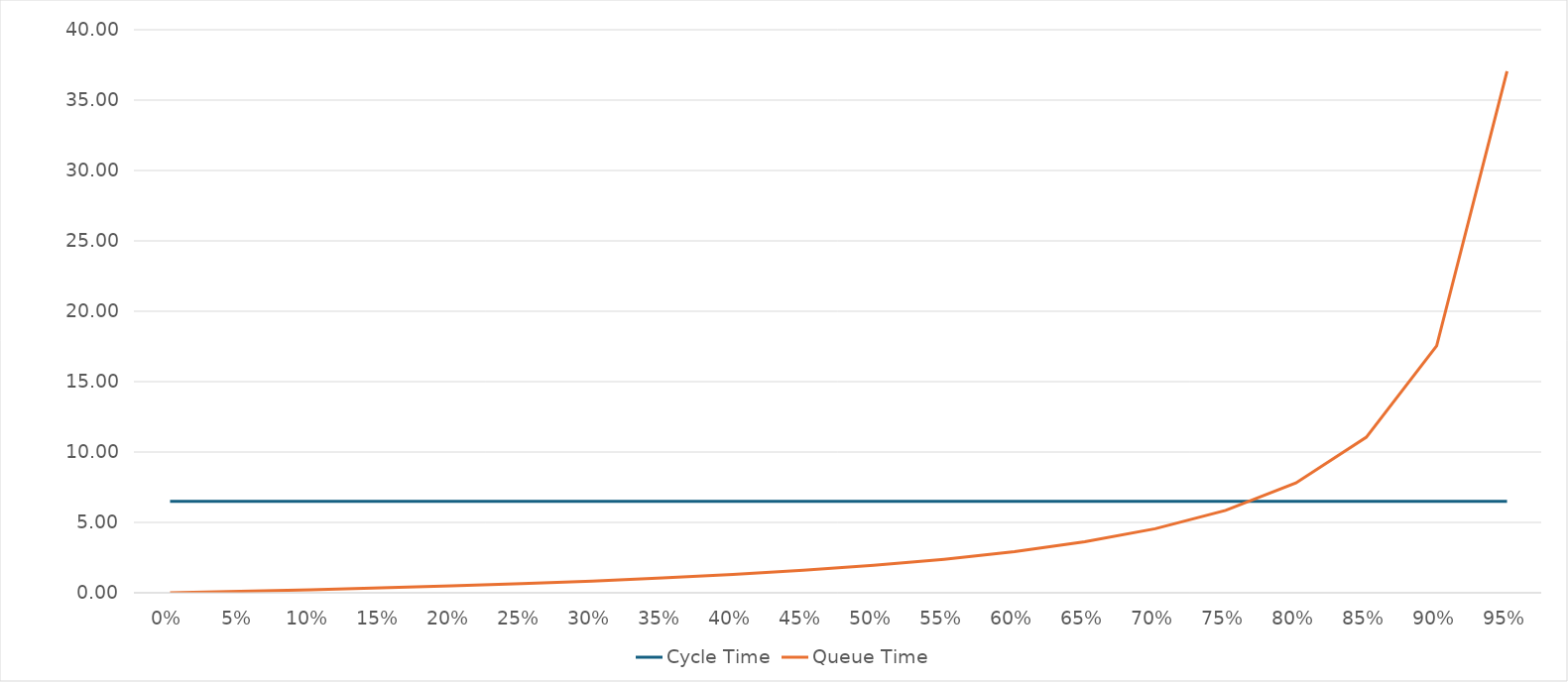
| Category | Cycle Time | Queue Time |
|---|---|---|
| 0.0 | 6.5 | 0 |
| 0.05 | 6.5 | 0.103 |
| 0.1 | 6.5 | 0.217 |
| 0.15 | 6.5 | 0.344 |
| 0.2 | 6.5 | 0.488 |
| 0.25 | 6.5 | 0.65 |
| 0.3 | 6.5 | 0.836 |
| 0.35 | 6.5 | 1.05 |
| 0.4 | 6.5 | 1.3 |
| 0.45 | 6.5 | 1.595 |
| 0.5 | 6.5 | 1.95 |
| 0.55 | 6.5 | 2.383 |
| 0.6 | 6.5 | 2.925 |
| 0.65 | 6.5 | 3.621 |
| 0.7 | 6.5 | 4.55 |
| 0.75 | 6.5 | 5.85 |
| 0.8 | 6.5 | 7.8 |
| 0.85 | 6.5 | 11.05 |
| 0.9 | 6.5 | 17.55 |
| 0.95 | 6.5 | 37.05 |